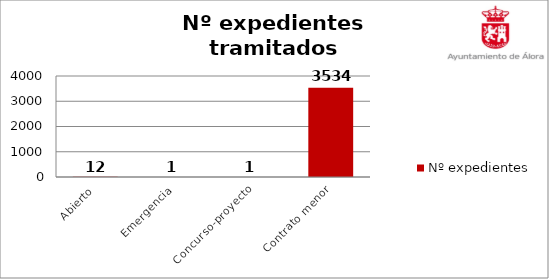
| Category | Nº expedientes |
|---|---|
| Abierto | 12 |
| Emergencia | 1 |
| Concurso-proyecto | 1 |
| Contrato menor | 3534 |